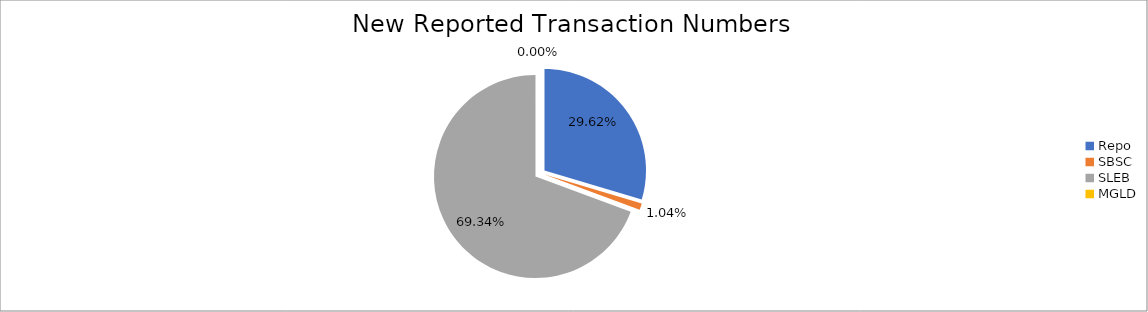
| Category | Series 0 |
|---|---|
| Repo | 275572 |
| SBSC | 9653 |
| SLEB | 645010 |
| MGLD | 31 |